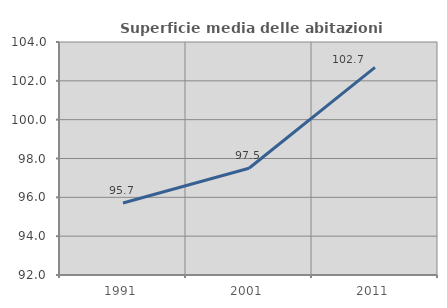
| Category | Superficie media delle abitazioni occupate |
|---|---|
| 1991.0 | 95.705 |
| 2001.0 | 97.499 |
| 2011.0 | 102.69 |